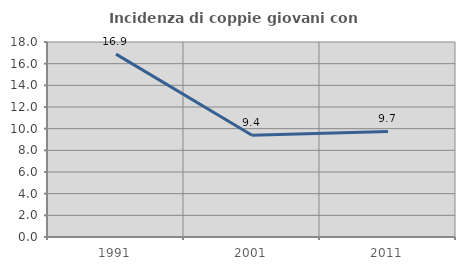
| Category | Incidenza di coppie giovani con figli |
|---|---|
| 1991.0 | 16.883 |
| 2001.0 | 9.396 |
| 2011.0 | 9.74 |